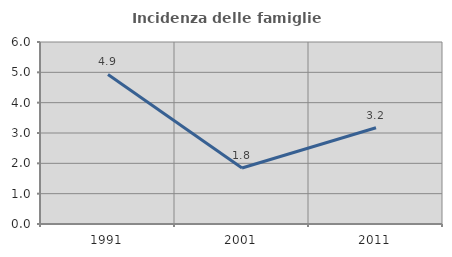
| Category | Incidenza delle famiglie numerose |
|---|---|
| 1991.0 | 4.93 |
| 2001.0 | 1.846 |
| 2011.0 | 3.173 |